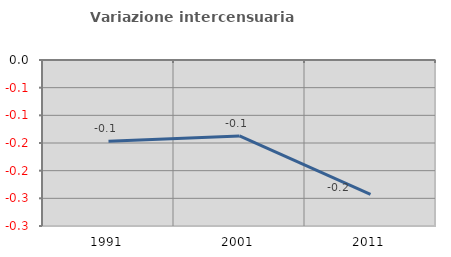
| Category | Variazione intercensuaria annua |
|---|---|
| 1991.0 | -0.147 |
| 2001.0 | -0.137 |
| 2011.0 | -0.243 |